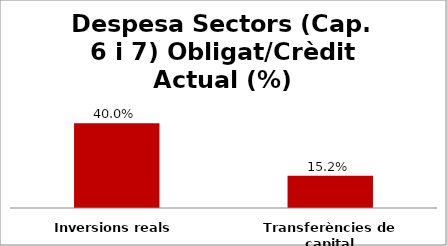
| Category | Series 0 |
|---|---|
| Inversions reals | 0.4 |
| Transferències de capital | 0.152 |